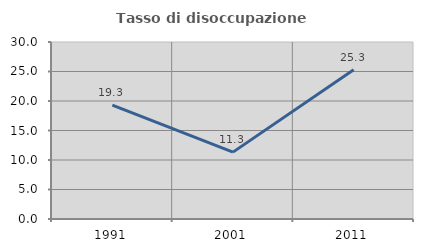
| Category | Tasso di disoccupazione giovanile  |
|---|---|
| 1991.0 | 19.289 |
| 2001.0 | 11.333 |
| 2011.0 | 25.301 |